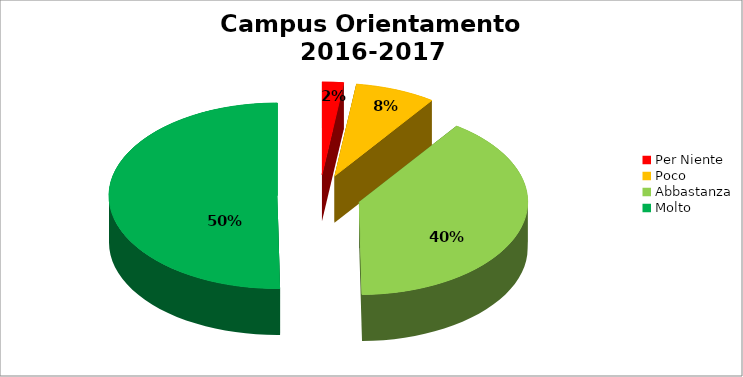
| Category | Series 0 |
|---|---|
| Per Niente | 0.021 |
| Poco | 0.077 |
| Abbastanza | 0.399 |
| Molto | 0.503 |